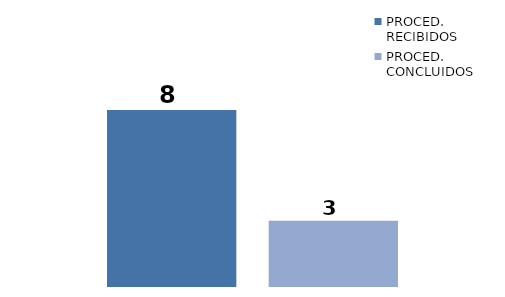
| Category | PROCED. RECIBIDOS | PROCED. CONCLUIDOS |
|---|---|---|
| 0 | 8 | 3 |